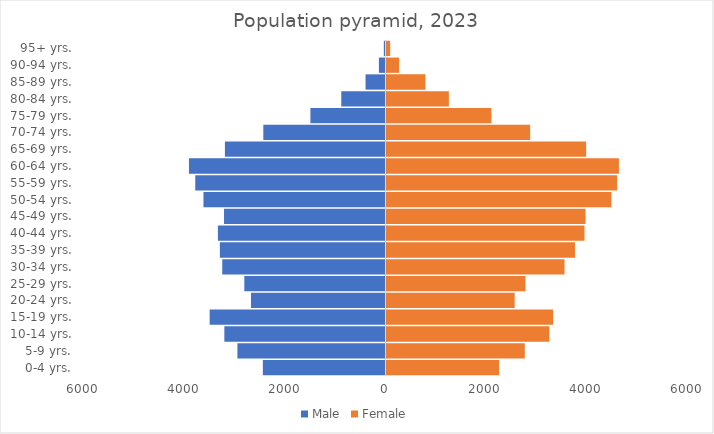
| Category | Male | Female |
|---|---|---|
| 0-4 yrs. | -2440.875 | 2239.509 |
| 5-9 yrs. | -2946.839 | 2752.27 |
| 10-14 yrs. | -3207.117 | 3240.779 |
| 15-19 yrs. | -3499.09 | 3315.522 |
| 20-24 yrs. | -2676.722 | 2550.724 |
| 25-29 yrs. | -2809.66 | 2765.497 |
| 30-34 yrs. | -3248.917 | 3542.483 |
| 35-39 yrs. | -3296.445 | 3751.039 |
| 40-44 yrs. | -3335.369 | 3940.053 |
| 45-49 yrs. | -3213.566 | 3960.048 |
| 50-54 yrs. | -3623.053 | 4475.505 |
| 55-59 yrs. | -3785.942 | 4588.486 |
| 60-64 yrs. | -3911.388 | 4625.209 |
| 65-69 yrs. | -3195.836 | 3972.761 |
| 70-74 yrs. | -2431.594 | 2858.984 |
| 75-79 yrs. | -1494.458 | 2089.042 |
| 80-84 yrs. | -880.136 | 1241.153 |
| 85-89 yrs. | -397.065 | 774.956 |
| 90-94 yrs. | -131.586 | 250.368 |
| 95+ yrs. | -33.352 | 72.921 |